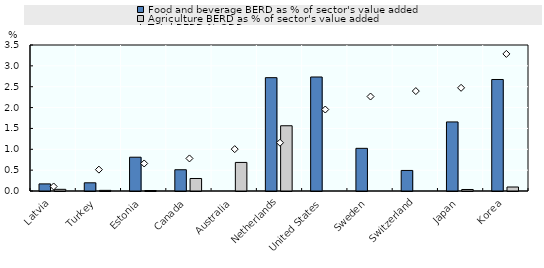
| Category | Food and beverage BERD as % of sector's value added | Agriculture BERD as % of sector's value added |
|---|---|---|
| Latvia | 0.17 | 0.04 |
| Turkey | 0.197 | 0.015 |
| Estonia | 0.81 | 0.011 |
| Canada | 0.51 | 0.3 |
| Australia | 0 | 0.685 |
| Netherlands | 2.717 | 1.564 |
| United States | 2.733 | 0 |
| Sweden | 1.023 | 0 |
| Switzerland | 0.493 | 0 |
| Japan | 1.656 | 0.036 |
| Korea | 2.673 | 0.096 |